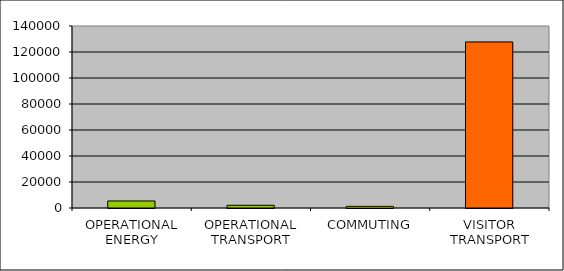
| Category | Series 0 |
|---|---|
| OPERATIONAL ENERGY | 5400 |
| OPERATIONAL TRANSPORT | 2100 |
| COMMUTING | 1271.818 |
| VISITOR TRANSPORT | 127729.412 |